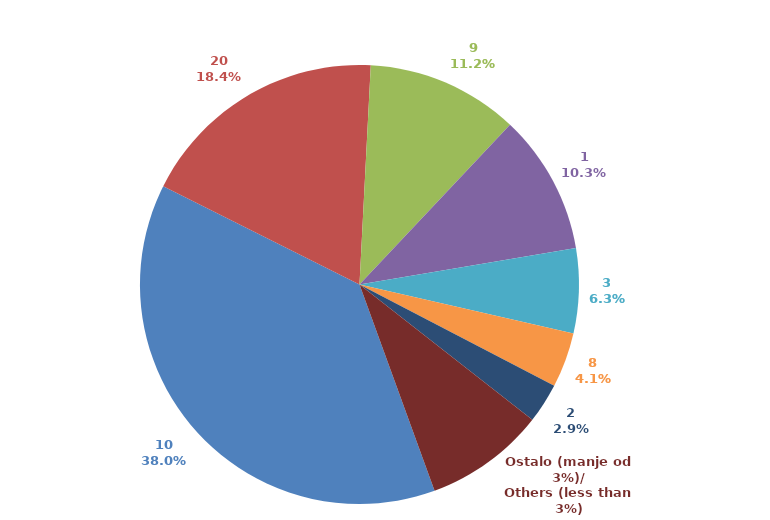
| Category | Series 0 |
|---|---|
| 10 | 0.379 |
| 20 | 0.184 |
| 9 | 0.112 |
| 1 | 0.103 |
| 3 | 0.062 |
| 8 | 0.04 |
| 2 | 0.029 |
| Ostalo (manje od 3%)/
Others (less than 3%) | 0.089 |